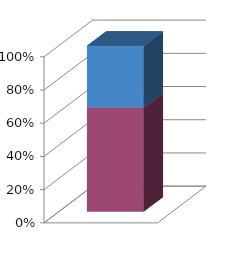
| Category | Series 0 | Series 1 | Series 2 |
|---|---|---|---|
| 0 | 62800 | 37200 | 0 |